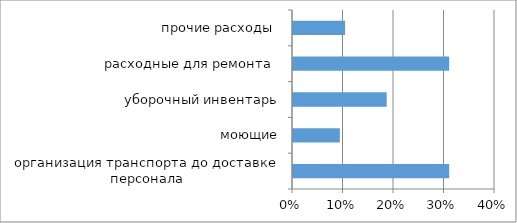
| Category | Series 0 |
|---|---|
|  организация транспорта до доставке персонала  | 0.309 |
|  моющие  | 0.093 |
|  уборочный инвентарь  | 0.186 |
|  расходные для ремонта   | 0.309 |
|  прочие расходы   | 0.103 |